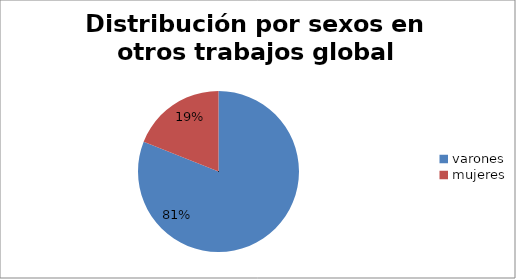
| Category | otros trabajos |
|---|---|
| varones | 486 |
| mujeres | 114 |